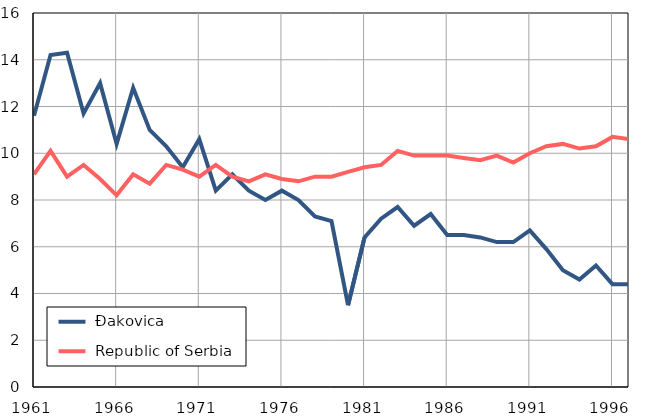
| Category |  Đakovica |  Republic of Serbia |
|---|---|---|
| 1961.0 | 11.6 | 9.1 |
| 1962.0 | 14.2 | 10.1 |
| 1963.0 | 14.3 | 9 |
| 1964.0 | 11.7 | 9.5 |
| 1965.0 | 13 | 8.9 |
| 1966.0 | 10.4 | 8.2 |
| 1967.0 | 12.8 | 9.1 |
| 1968.0 | 11 | 8.7 |
| 1969.0 | 10.3 | 9.5 |
| 1970.0 | 9.4 | 9.3 |
| 1971.0 | 10.6 | 9 |
| 1972.0 | 8.4 | 9.5 |
| 1973.0 | 9.1 | 9 |
| 1974.0 | 8.4 | 8.8 |
| 1975.0 | 8 | 9.1 |
| 1976.0 | 8.4 | 8.9 |
| 1977.0 | 8 | 8.8 |
| 1978.0 | 7.3 | 9 |
| 1979.0 | 7.1 | 9 |
| 1980.0 | 3.5 | 9.2 |
| 1981.0 | 6.4 | 9.4 |
| 1982.0 | 7.2 | 9.5 |
| 1983.0 | 7.7 | 10.1 |
| 1984.0 | 6.9 | 9.9 |
| 1985.0 | 7.4 | 9.9 |
| 1986.0 | 6.5 | 9.9 |
| 1987.0 | 6.5 | 9.8 |
| 1988.0 | 6.4 | 9.7 |
| 1989.0 | 6.2 | 9.9 |
| 1990.0 | 6.2 | 9.6 |
| 1991.0 | 6.7 | 10 |
| 1992.0 | 5.9 | 10.3 |
| 1993.0 | 5 | 10.4 |
| 1994.0 | 4.6 | 10.2 |
| 1995.0 | 5.2 | 10.3 |
| 1996.0 | 4.4 | 10.7 |
| 1997.0 | 4.4 | 10.6 |